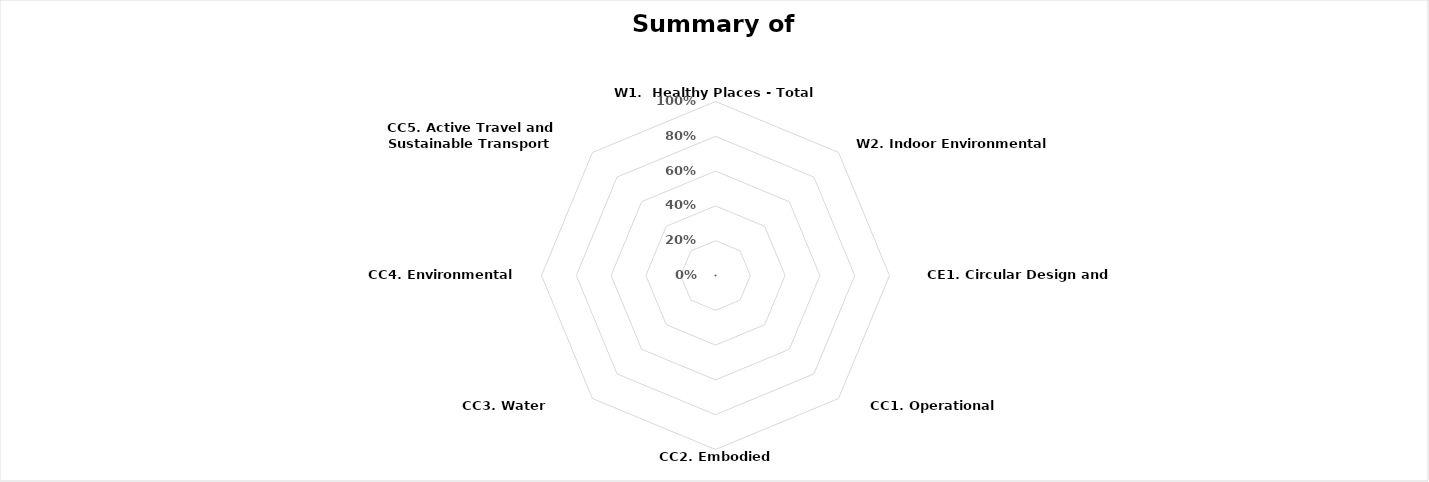
| Category | Series 0 |
|---|---|
| W1.  Healthy Places - Total Wellbeing | 0 |
| W2. Indoor Environmental Quality | 0 |
| CE1. Circular Design and Construction | 0 |
| CC1. Operational Emissions | 0 |
| CC2. Embodied Carbon | 0 |
| CC3. Water Consumption | 0 |
| CC4. Environmental Security | 0 |
| CC5. Active Travel and Sustainable Transport | 0 |